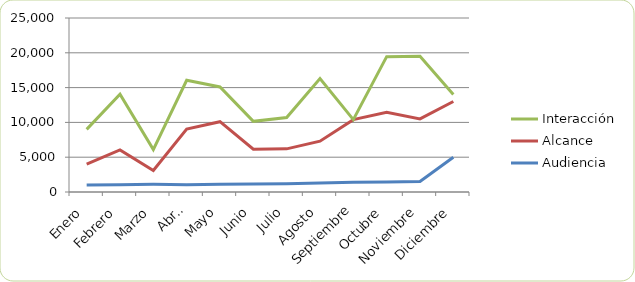
| Category | Audiencia | Alcance | Interacción |
|---|---|---|---|
| Enero | 1000 | 3000 | 5000 |
| Febrero | 1050 | 5000 | 8000 |
| Marzo | 1100 | 2000 | 3000 |
| Abril | 1050 | 8000 | 7000 |
| Mayo | 1100 | 9000 | 5000 |
| Junio | 1150 | 5000 | 4000 |
| Julio | 1200 | 5000 | 4500 |
| Agosto | 1300 | 6000 | 9000 |
| Septiembre | 1400 | 9000 | 0 |
| Octubre | 1450 | 10000 | 8000 |
| Noviembre | 1500 | 9000 | 9000 |
| Diciembre | 5000 | 8000 | 1000 |